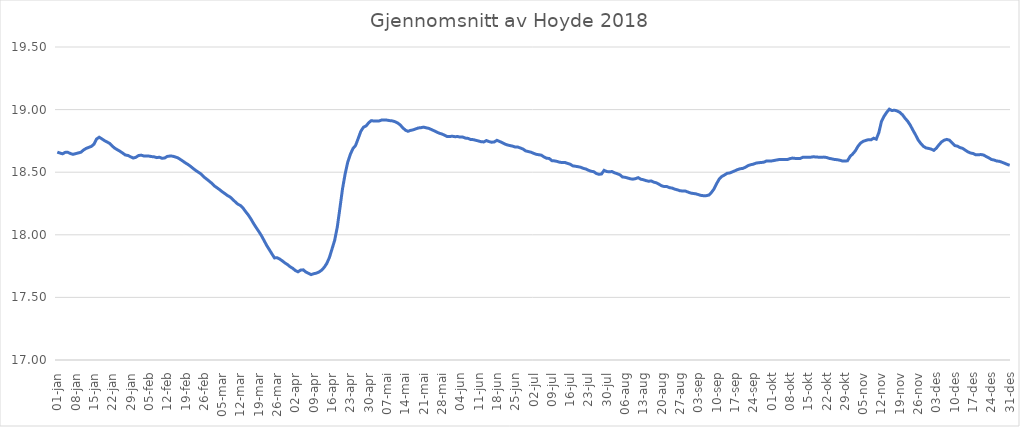
| Category | Gjennomsnitt av Hoyde 2018 |
|---|---|
| 01-jan | 18.661 |
| 02-jan | 18.653 |
| 03-jan | 18.647 |
| 04-jan | 18.658 |
| 05-jan | 18.659 |
| 06-jan | 18.649 |
| 07-jan | 18.643 |
| 08-jan | 18.648 |
| 09-jan | 18.654 |
| 10-jan | 18.659 |
| 11-jan | 18.677 |
| 12-jan | 18.69 |
| 13-jan | 18.698 |
| 14-jan | 18.706 |
| 15-jan | 18.723 |
| 16-jan | 18.765 |
| 17-jan | 18.779 |
| 18-jan | 18.767 |
| 19-jan | 18.753 |
| 20-jan | 18.742 |
| 21-jan | 18.73 |
| 22-jan | 18.709 |
| 23-jan | 18.691 |
| 24-jan | 18.679 |
| 25-jan | 18.667 |
| 26-jan | 18.652 |
| 27-jan | 18.637 |
| 28-jan | 18.634 |
| 29-jan | 18.623 |
| 30-jan | 18.613 |
| 31-jan | 18.619 |
| 01-feb | 18.633 |
| 02-feb | 18.636 |
| 03-feb | 18.63 |
| 04-feb | 18.63 |
| 05-feb | 18.629 |
| 06-feb | 18.625 |
| 07-feb | 18.623 |
| 08-feb | 18.617 |
| 09-feb | 18.62 |
| 10-feb | 18.611 |
| 11-feb | 18.613 |
| 12-feb | 18.626 |
| 13-feb | 18.629 |
| 14-feb | 18.628 |
| 15-feb | 18.623 |
| 16-feb | 18.615 |
| 17-feb | 18.602 |
| 18-feb | 18.588 |
| 19-feb | 18.574 |
| 20-feb | 18.561 |
| 21-feb | 18.545 |
| 22-feb | 18.528 |
| 23-feb | 18.512 |
| 24-feb | 18.499 |
| 25-feb | 18.485 |
| 26-feb | 18.462 |
| 27-feb | 18.446 |
| 28-feb | 18.429 |
| 01-mar | 18.412 |
| 02-mar | 18.391 |
| 03-mar | 18.376 |
| 04-mar | 18.361 |
| 05-mar | 18.344 |
| 06-mar | 18.33 |
| 07-mar | 18.314 |
| 08-mar | 18.303 |
| 09-mar | 18.284 |
| 10-mar | 18.263 |
| 11-mar | 18.245 |
| 12-mar | 18.234 |
| 13-mar | 18.213 |
| 14-mar | 18.185 |
| 15-mar | 18.158 |
| 16-mar | 18.126 |
| 17-mar | 18.091 |
| 18-mar | 18.058 |
| 19-mar | 18.027 |
| 20-mar | 17.994 |
| 21-mar | 17.955 |
| 22-mar | 17.916 |
| 23-mar | 17.882 |
| 24-mar | 17.848 |
| 25-mar | 17.816 |
| 26-mar | 17.817 |
| 27-mar | 17.806 |
| 28-mar | 17.792 |
| 29-mar | 17.775 |
| 30-mar | 17.762 |
| 31-mar | 17.745 |
| 01-apr | 17.732 |
| 02-apr | 17.714 |
| 03-apr | 17.704 |
| 04-apr | 17.718 |
| 05-apr | 17.72 |
| 06-apr | 17.703 |
| 07-apr | 17.692 |
| 08-apr | 17.682 |
| 09-apr | 17.689 |
| 10-apr | 17.694 |
| 11-apr | 17.702 |
| 12-apr | 17.717 |
| 13-apr | 17.74 |
| 14-apr | 17.771 |
| 15-apr | 17.819 |
| 16-apr | 17.887 |
| 17-apr | 17.955 |
| 18-apr | 18.061 |
| 19-apr | 18.211 |
| 20-apr | 18.366 |
| 21-apr | 18.485 |
| 22-apr | 18.58 |
| 23-apr | 18.643 |
| 24-apr | 18.689 |
| 25-apr | 18.713 |
| 26-apr | 18.769 |
| 27-apr | 18.826 |
| 28-apr | 18.859 |
| 29-apr | 18.869 |
| 30-apr | 18.895 |
| 01-mai | 18.912 |
| 02-mai | 18.909 |
| 03-mai | 18.909 |
| 04-mai | 18.91 |
| 05-mai | 18.917 |
| 06-mai | 18.917 |
| 07-mai | 18.916 |
| 08-mai | 18.912 |
| 09-mai | 18.91 |
| 10-mai | 18.904 |
| 11-mai | 18.894 |
| 12-mai | 18.879 |
| 13-mai | 18.855 |
| 14-mai | 18.837 |
| 15-mai | 18.827 |
| 16-mai | 18.834 |
| 17-mai | 18.838 |
| 18-mai | 18.846 |
| 19-mai | 18.853 |
| 20-mai | 18.856 |
| 21-mai | 18.86 |
| 22-mai | 18.854 |
| 23-mai | 18.85 |
| 24-mai | 18.84 |
| 25-mai | 18.831 |
| 26-mai | 18.821 |
| 27-mai | 18.811 |
| 28-mai | 18.805 |
| 29-mai | 18.796 |
| 30-mai | 18.785 |
| 31-mai | 18.785 |
| 01-jun | 18.787 |
| 02-jun | 18.783 |
| 03-jun | 18.785 |
| 04-jun | 18.78 |
| 05-jun | 18.78 |
| 06-jun | 18.772 |
| 07-jun | 18.77 |
| 08-jun | 18.761 |
| 09-jun | 18.76 |
| 10-jun | 18.755 |
| 11-jun | 18.749 |
| 12-jun | 18.743 |
| 13-jun | 18.742 |
| 14-jun | 18.753 |
| 15-jun | 18.744 |
| 16-jun | 18.739 |
| 17-jun | 18.742 |
| 18-jun | 18.755 |
| 19-jun | 18.746 |
| 20-jun | 18.736 |
| 21-jun | 18.725 |
| 22-jun | 18.718 |
| 23-jun | 18.713 |
| 24-jun | 18.708 |
| 25-jun | 18.701 |
| 26-jun | 18.701 |
| 27-jun | 18.693 |
| 28-jun | 18.685 |
| 29-jun | 18.67 |
| 30-jun | 18.665 |
| 01-jul | 18.66 |
| 02-jul | 18.651 |
| 03-jul | 18.643 |
| 04-jul | 18.639 |
| 05-jul | 18.636 |
| 06-jul | 18.622 |
| 07-jul | 18.612 |
| 08-jul | 18.61 |
| 09-jul | 18.592 |
| 10-jul | 18.59 |
| 11-jul | 18.586 |
| 12-jul | 18.58 |
| 13-jul | 18.577 |
| 14-jul | 18.578 |
| 15-jul | 18.57 |
| 16-jul | 18.564 |
| 17-jul | 18.551 |
| 18-jul | 18.548 |
| 19-jul | 18.544 |
| 20-jul | 18.54 |
| 21-jul | 18.531 |
| 22-jul | 18.526 |
| 23-jul | 18.515 |
| 24-jul | 18.508 |
| 25-jul | 18.504 |
| 26-jul | 18.49 |
| 27-jul | 18.483 |
| 28-jul | 18.486 |
| 29-jul | 18.515 |
| 30-jul | 18.505 |
| 31-jul | 18.503 |
| 01-aug | 18.505 |
| 02-aug | 18.495 |
| 03-aug | 18.488 |
| 04-aug | 18.48 |
| 05-aug | 18.462 |
| 06-aug | 18.459 |
| 07-aug | 18.454 |
| 08-aug | 18.447 |
| 09-aug | 18.444 |
| 10-aug | 18.449 |
| 11-aug | 18.457 |
| 12-aug | 18.444 |
| 13-aug | 18.44 |
| 14-aug | 18.433 |
| 15-aug | 18.428 |
| 16-aug | 18.43 |
| 17-aug | 18.42 |
| 18-aug | 18.415 |
| 19-aug | 18.404 |
| 20-aug | 18.391 |
| 21-aug | 18.385 |
| 22-aug | 18.385 |
| 23-aug | 18.376 |
| 24-aug | 18.373 |
| 25-aug | 18.364 |
| 26-aug | 18.359 |
| 27-aug | 18.352 |
| 28-aug | 18.35 |
| 29-aug | 18.349 |
| 30-aug | 18.342 |
| 31-aug | 18.334 |
| 01-sep | 18.33 |
| 02-sep | 18.327 |
| 03-sep | 18.321 |
| 04-sep | 18.315 |
| 05-sep | 18.312 |
| 06-sep | 18.313 |
| 07-sep | 18.317 |
| 08-sep | 18.338 |
| 09-sep | 18.366 |
| 10-sep | 18.409 |
| 11-sep | 18.446 |
| 12-sep | 18.466 |
| 13-sep | 18.478 |
| 14-sep | 18.491 |
| 15-sep | 18.494 |
| 16-sep | 18.503 |
| 17-sep | 18.511 |
| 18-sep | 18.521 |
| 19-sep | 18.528 |
| 20-sep | 18.53 |
| 21-sep | 18.54 |
| 22-sep | 18.552 |
| 23-sep | 18.56 |
| 24-sep | 18.564 |
| 25-sep | 18.572 |
| 26-sep | 18.576 |
| 27-sep | 18.577 |
| 28-sep | 18.58 |
| 29-sep | 18.589 |
| 30-sep | 18.59 |
| 01-okt | 18.59 |
| 02-okt | 18.594 |
| 03-okt | 18.598 |
| 04-okt | 18.601 |
| 05-okt | 18.602 |
| 06-okt | 18.602 |
| 07-okt | 18.601 |
| 08-okt | 18.608 |
| 09-okt | 18.613 |
| 10-okt | 18.61 |
| 11-okt | 18.61 |
| 12-okt | 18.61 |
| 13-okt | 18.62 |
| 14-okt | 18.62 |
| 15-okt | 18.62 |
| 16-okt | 18.62 |
| 17-okt | 18.623 |
| 18-okt | 18.621 |
| 19-okt | 18.62 |
| 20-okt | 18.62 |
| 21-okt | 18.621 |
| 22-okt | 18.618 |
| 23-okt | 18.611 |
| 24-okt | 18.607 |
| 25-okt | 18.602 |
| 26-okt | 18.6 |
| 27-okt | 18.596 |
| 28-okt | 18.59 |
| 29-okt | 18.589 |
| 30-okt | 18.591 |
| 31-okt | 18.626 |
| 01-nov | 18.646 |
| 02-nov | 18.67 |
| 03-nov | 18.706 |
| 04-nov | 18.733 |
| 05-nov | 18.746 |
| 06-nov | 18.754 |
| 07-nov | 18.76 |
| 08-nov | 18.758 |
| 09-nov | 18.771 |
| 10-nov | 18.764 |
| 11-nov | 18.817 |
| 12-nov | 18.907 |
| 13-nov | 18.947 |
| 14-nov | 18.978 |
| 15-nov | 19.003 |
| 16-nov | 18.993 |
| 17-nov | 18.995 |
| 18-nov | 18.989 |
| 19-nov | 18.978 |
| 20-nov | 18.959 |
| 21-nov | 18.931 |
| 22-nov | 18.907 |
| 23-nov | 18.876 |
| 24-nov | 18.836 |
| 25-nov | 18.799 |
| 26-nov | 18.758 |
| 27-nov | 18.73 |
| 28-nov | 18.707 |
| 29-nov | 18.694 |
| 30-nov | 18.69 |
| 01-des | 18.684 |
| 02-des | 18.674 |
| 03-des | 18.693 |
| 04-des | 18.72 |
| 05-des | 18.742 |
| 06-des | 18.756 |
| 07-des | 18.762 |
| 08-des | 18.755 |
| 09-des | 18.734 |
| 10-des | 18.713 |
| 11-des | 18.708 |
| 12-des | 18.697 |
| 13-des | 18.691 |
| 14-des | 18.676 |
| 15-des | 18.663 |
| 16-des | 18.654 |
| 17-des | 18.649 |
| 18-des | 18.639 |
| 19-des | 18.639 |
| 20-des | 18.641 |
| 21-des | 18.638 |
| 22-des | 18.625 |
| 23-des | 18.615 |
| 24-des | 18.602 |
| 25-des | 18.597 |
| 26-des | 18.59 |
| 27-des | 18.587 |
| 28-des | 18.58 |
| 29-des | 18.572 |
| 30-des | 18.563 |
| 31-des | 18.555 |